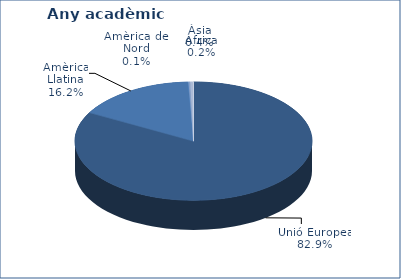
| Category | % |
|---|---|
| Unió Europea | 1822 |
| Resta d'Europa | 3 |
| Amèrica Llatina | 356 |
| Amèrica del Nord | 2 |
| Àfrica | 5 |
| Àsia | 8 |
| Oceania | 2 |